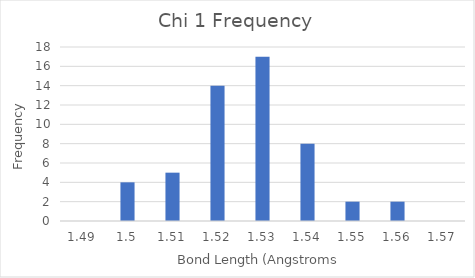
| Category | Chi 1 |
|---|---|
| 1.49 | 0 |
| 1.5 | 4 |
| 1.51 | 5 |
| 1.52 | 14 |
| 1.53 | 17 |
| 1.54 | 8 |
| 1.55 | 2 |
| 1.56 | 2 |
| 1.57 | 0 |